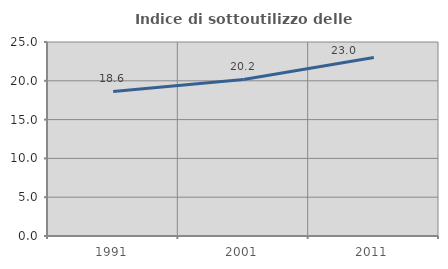
| Category | Indice di sottoutilizzo delle abitazioni  |
|---|---|
| 1991.0 | 18.623 |
| 2001.0 | 20.168 |
| 2011.0 | 23.009 |